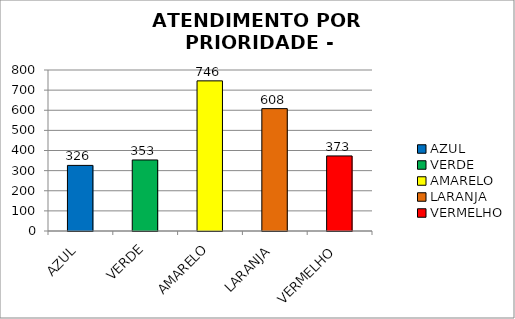
| Category | Total Regional: |
|---|---|
| AZUL | 326 |
| VERDE | 353 |
| AMARELO | 746 |
| LARANJA | 608 |
| VERMELHO | 373 |